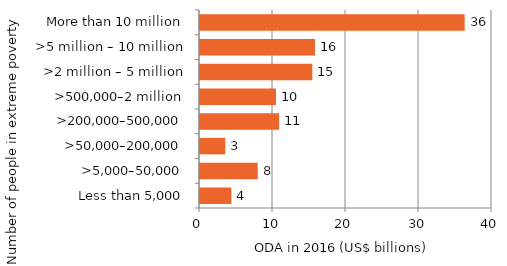
| Category | Series 0 |
|---|---|
| Less than 5,000 | 4295.052 |
| >5,000–50,000 | 7911.303 |
| >50,000–200,000 | 3465.775 |
| >200,000–500,000 | 10837.64 |
| >500,000–2 million | 10409.693 |
| >2 million – 5 million | 15386.805 |
| >5 million – 10 million | 15755.86 |
| More than 10 million | 36253.912 |